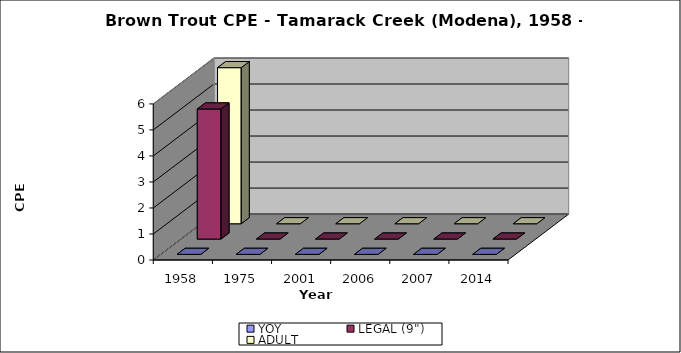
| Category | YOY | LEGAL (9") | ADULT |
|---|---|---|---|
| 1958.0 | 0 | 5 | 6 |
| 1975.0 | 0 | 0 | 0 |
| 2001.0 | 0 | 0 | 0 |
| 2006.0 | 0 | 0 | 0 |
| 2007.0 | 0 | 0 | 0 |
| 2014.0 | 0 | 0 | 0 |